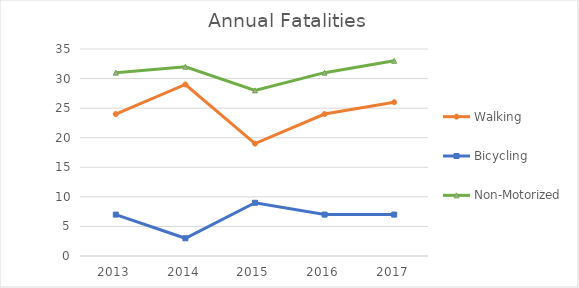
| Category | Walking | Bicycling | Non-Motorized |
|---|---|---|---|
| 2013 | 24 | 7 | 31 |
| 2014 | 29 | 3 | 32 |
| 2015 | 19 | 9 | 28 |
| 2016 | 24 | 7 | 31 |
| 2017 | 26 | 7 | 33 |